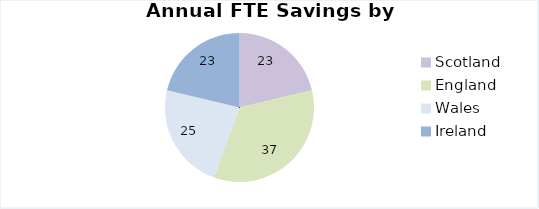
| Category | Series 0 |
|---|---|
| Scotland | 23 |
| England | 37 |
| Wales | 25 |
| Ireland | 23 |